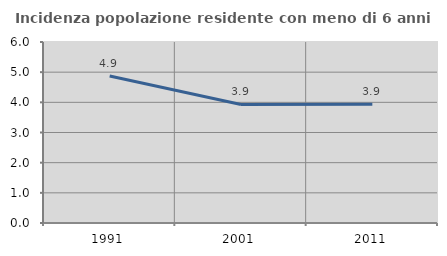
| Category | Incidenza popolazione residente con meno di 6 anni |
|---|---|
| 1991.0 | 4.871 |
| 2001.0 | 3.931 |
| 2011.0 | 3.936 |